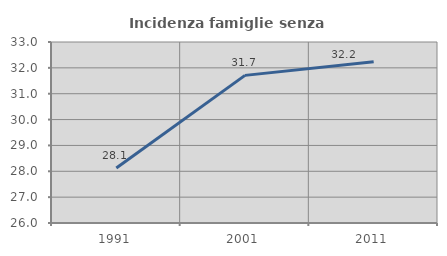
| Category | Incidenza famiglie senza nuclei |
|---|---|
| 1991.0 | 28.128 |
| 2001.0 | 31.709 |
| 2011.0 | 32.234 |